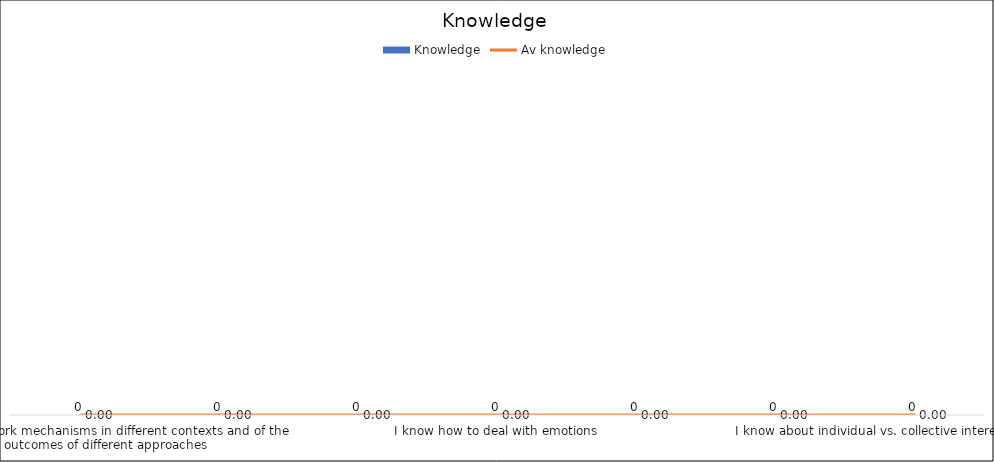
| Category | Knowledge |
|---|---|
| I know about teamwork mechanisms in different contexts and of the possible outcomes of different approaches | 0 |
| I know my personal limitations and how to overcome them | 0 |
| I know about coaching methods | 0 |
| I know how to deal with emotions | 0 |
| I hknow about conflict prevention and transformation | 0 |
| I have knowledge about feedback techniques (how to give feedback, how to receive it, etc.) | 0 |
| I know about individual vs. collective interests and focuses | 0 |